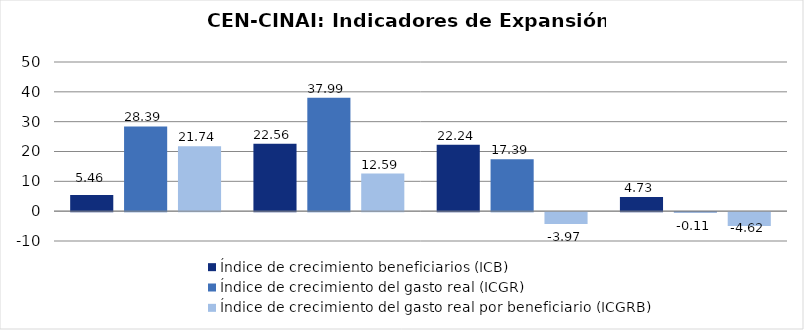
| Category | Índice de crecimiento beneficiarios (ICB)  | Índice de crecimiento del gasto real (ICGR)  | Índice de crecimiento del gasto real por beneficiario (ICGRB)  |
|---|---|---|---|
| Total programa | 5.46 | 28.389 | 21.742 |
| Total API | 22.561 | 37.993 | 12.591 |
| Total Leche | 22.236 | 17.389 | -3.966 |
| Distribución de alimentos a familias  | 4.731 | -0.112 | -4.624 |